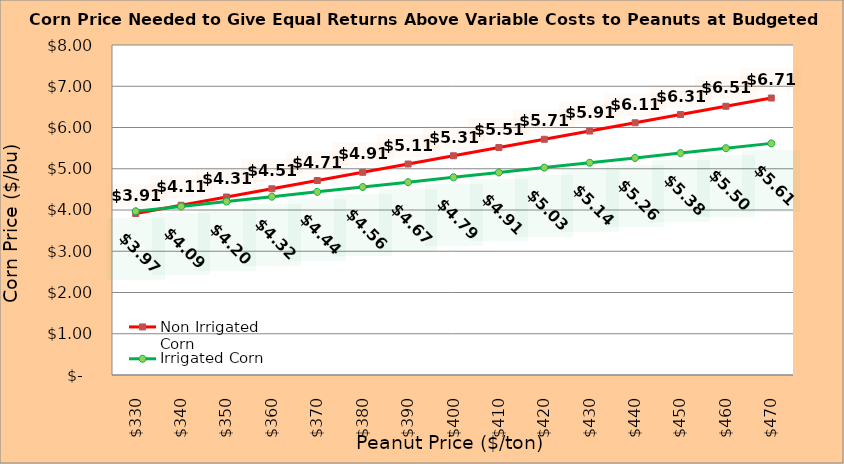
| Category | Non Irrigated Corn | Irrigated Corn |
|---|---|---|
| 330.0 | 3.915 | 3.97 |
| 340.0 | 4.115 | 4.087 |
| 350.0 | 4.315 | 4.205 |
| 360.0 | 4.515 | 4.322 |
| 370.0 | 4.715 | 4.44 |
| 380.0 | 4.915 | 4.557 |
| 390.0 | 5.115 | 4.675 |
| 400.0 | 5.315 | 4.792 |
| 410.0 | 5.515 | 4.91 |
| 420.0 | 5.715 | 5.027 |
| 430.0 | 5.915 | 5.145 |
| 440.0 | 6.115 | 5.262 |
| 450.0 | 6.315 | 5.38 |
| 460.0 | 6.515 | 5.497 |
| 470.0 | 6.715 | 5.615 |